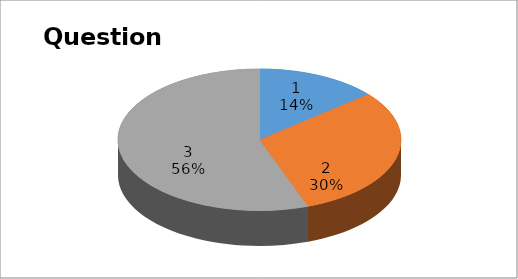
| Category | Series 0 |
|---|---|
| 0 | 5 |
| 1 | 11 |
| 2 | 20 |